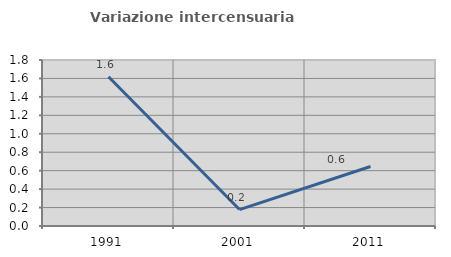
| Category | Variazione intercensuaria annua |
|---|---|
| 1991.0 | 1.618 |
| 2001.0 | 0.178 |
| 2011.0 | 0.645 |